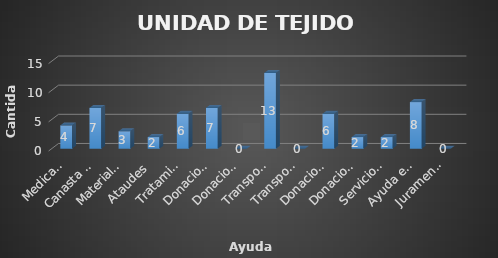
| Category | UNIDAD DE TEJIDO SOCIAL  |
|---|---|
| Medicamentos | 4 |
| Canasta basica | 7 |
| Materiales de construcion | 3 |
| Ataudes | 2 |
| Tratamiento medicos | 6 |
| Donaciones a ADESCO | 7 |
| Donaciones a Escuelas (pintura) | 0 |
| Transporte a instituciones  | 13 |
| Transportes (consulta a centros de salud) | 0 |
| Donaciones a otras Instituciones  | 6 |
| Donacion de laminas | 2 |
| Servicios funerarios | 2 |
| Ayuda economica. | 8 |
| Juramentacion de ADESCOS  | 0 |